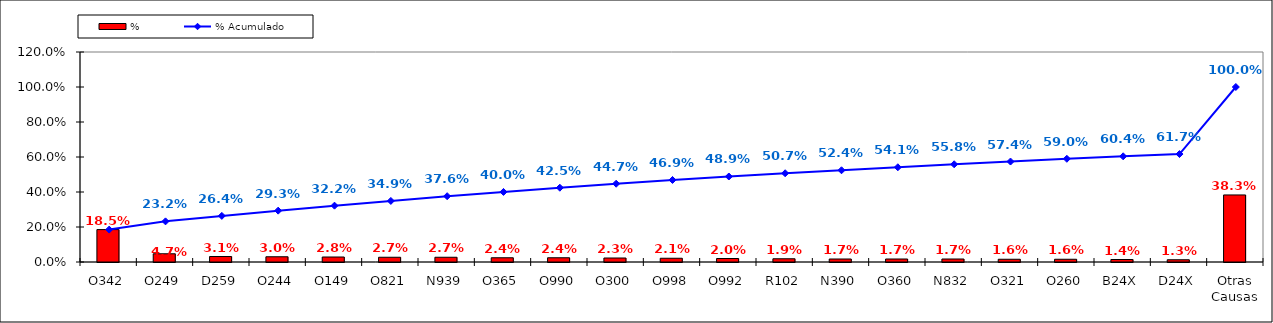
| Category | % |
|---|---|
| O342 | 0.185 |
| O249 | 0.047 |
| D259 | 0.031 |
| O244 | 0.03 |
| O149 | 0.028 |
| O821 | 0.027 |
| N939 | 0.027 |
| O365 | 0.024 |
| O990 | 0.024 |
| O300 | 0.023 |
| O998 | 0.021 |
| O992 | 0.02 |
| R102 | 0.019 |
| N390 | 0.017 |
| O360 | 0.017 |
| N832 | 0.017 |
| O321 | 0.016 |
| O260 | 0.016 |
| B24X | 0.014 |
| D24X | 0.013 |
| Otras Causas | 0.383 |